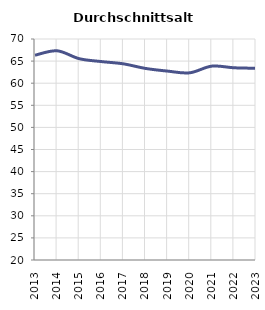
| Category | Durchschnittsalter |
|---|---|
| 2013.0 | 66.33 |
| 2014.0 | 67.331 |
| 2015.0 | 65.547 |
| 2016.0 | 64.894 |
| 2017.0 | 64.38 |
| 2018.0 | 63.342 |
| 2019.0 | 62.735 |
| 2020.0 | 62.35 |
| 2021.0 | 63.861 |
| 2022.0 | 63.49 |
| 2023.0 | 63.381 |